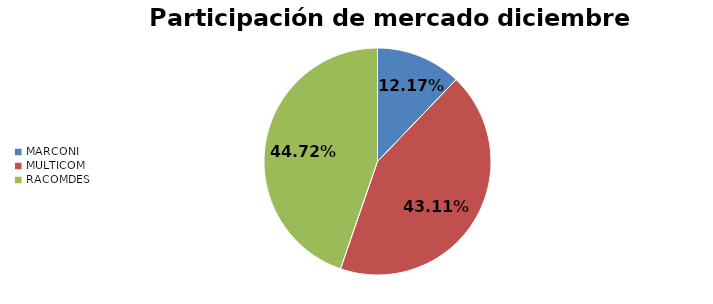
| Category | Series 0 |
|---|---|
| MARCONI | 0.122 |
| MULTICOM | 0.431 |
| RACOMDES | 0.447 |